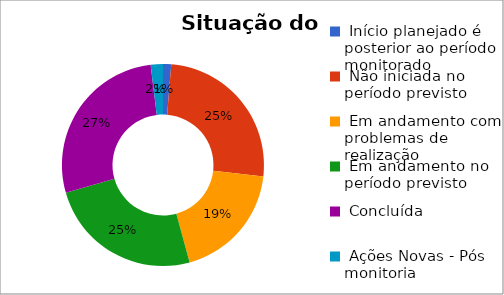
| Category | Series 0 |
|---|---|
|  Início planejado é posterior ao período monitorado | 0.013 |
|  Não iniciada no período previsto | 0.255 |
|  Em andamento com problemas de realização | 0.19 |
|  Em andamento no período previsto  | 0.248 |
|  Concluída | 0.275 |
|  Ações Novas - Pós monitoria | 0.02 |